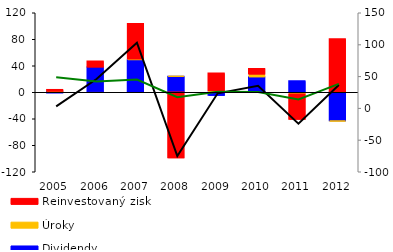
| Category | Dividendy | Úroky | Reinvestovaný zisk |
|---|---|---|---|
| 2005.0 | -0.58 | 1.433 | 2.395 |
| 2006.0 | 37.904 | -0.669 | 9.035 |
| 2007.0 | 48.85 | 1.203 | 53.347 |
| 2008.0 | 23.892 | 0.422 | -99.321 |
| 2009.0 | -5.044 | 2.313 | 26.481 |
| 2010.0 | 23.016 | 4.21 | 8.228 |
| 2011.0 | 16.981 | -3.07 | -37.915 |
| 2012.0 | -43.33 | -0.184 | 80.265 |